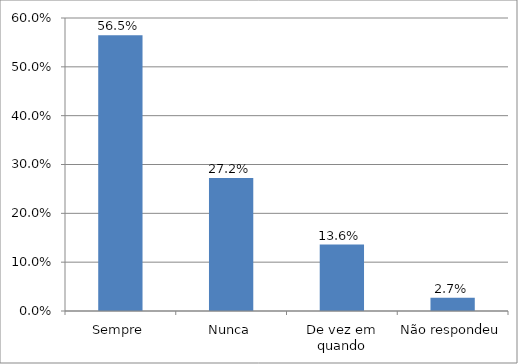
| Category | Series 0 |
|---|---|
| Sempre | 0.565 |
| Nunca | 0.272 |
| De vez em quando | 0.136 |
| Não respondeu | 0.027 |